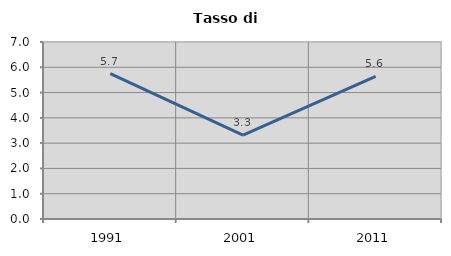
| Category | Tasso di disoccupazione   |
|---|---|
| 1991.0 | 5.748 |
| 2001.0 | 3.318 |
| 2011.0 | 5.644 |